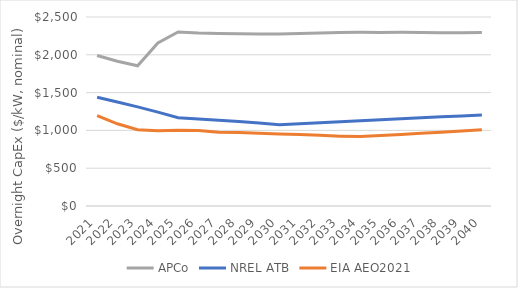
| Category | APCo | NREL ATB | EIA AEO2021 |
|---|---|---|---|
| 2021.0 | 1990.877 | 1437.527 | 1194.418 |
| 2022.0 | 1914.51 | 1376.163 | 1087.172 |
| 2023.0 | 1855.045 | 1310.832 | 1008.733 |
| 2024.0 | 2157.643 | 1241.374 | 996.739 |
| 2025.0 | 2302.672 | 1167.624 | 1001.381 |
| 2026.0 | 2286.866 | 1152.273 | 999.177 |
| 2027.0 | 2281.116 | 1135.425 | 976.886 |
| 2028.0 | 2278.083 | 1117.015 | 970.737 |
| 2029.0 | 2275.484 | 1096.974 | 962.962 |
| 2030.0 | 2275.441 | 1075.233 | 954.011 |
| 2031.0 | 2280.762 | 1088.337 | 944.811 |
| 2032.0 | 2289.271 | 1101.425 | 934.272 |
| 2033.0 | 2294.21 | 1114.487 | 924.09 |
| 2034.0 | 2297.743 | 1127.513 | 919.301 |
| 2035.0 | 2296.53 | 1140.495 | 932.864 |
| 2036.0 | 2298.216 | 1153.42 | 946.734 |
| 2037.0 | 2296.385 | 1166.279 | 961.501 |
| 2038.0 | 2293.056 | 1179.06 | 976.706 |
| 2039.0 | 2292.058 | 1191.752 | 991.997 |
| 2040.0 | 2294.35 | 1204.341 | 1007.016 |